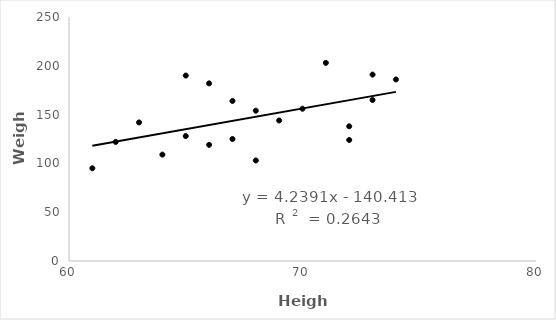
| Category | Weight |
|---|---|
| 61.0 | 95 |
| 62.0 | 122 |
| 63.0 | 142 |
| 64.0 | 109 |
| 65.0 | 128 |
| 65.0 | 190 |
| 66.0 | 119 |
| 66.0 | 182 |
| 67.0 | 164 |
| 67.0 | 125 |
| 68.0 | 103 |
| 68.0 | 154 |
| 69.0 | 144 |
| 70.0 | 156 |
| 71.0 | 203 |
| 72.0 | 124 |
| 72.0 | 138 |
| 73.0 | 165 |
| 73.0 | 191 |
| 74.0 | 186 |